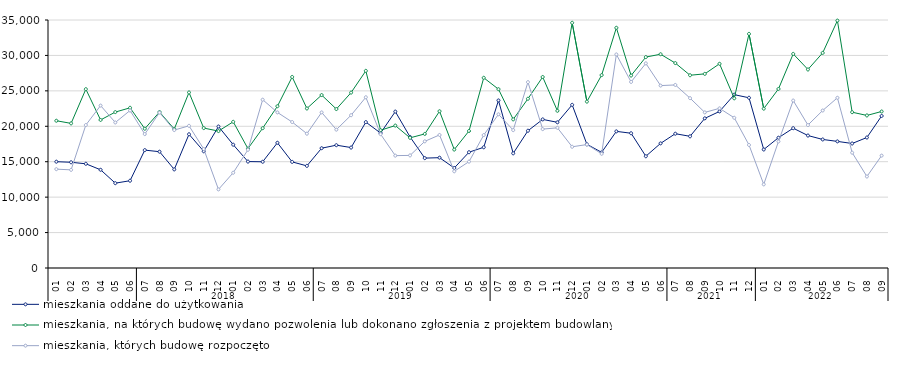
| Category | mieszkania oddane do użytkowania | mieszkania, na których budowę wydano pozwolenia lub dokonano zgłoszenia z projektem budowlanym | mieszkania, których budowę rozpoczęto |
|---|---|---|---|
| 0 | 15005 | 20783 | 13949 |
| 1 | 14921 | 20410 | 13851 |
| 2 | 14708 | 25239 | 20178 |
| 3 | 13861 | 20895 | 22924 |
| 4 | 11972 | 22003 | 20536 |
| 5 | 12319 | 22608 | 22228 |
| 6 | 16637 | 19658 | 18900 |
| 7 | 16415 | 22017 | 21929 |
| 8 | 13914 | 19613 | 19466 |
| 9 | 18871 | 24773 | 20063 |
| 10 | 16470 | 19748 | 16792 |
| 11 | 19970 | 19325 | 11091 |
| 12 | 17405 | 20630 | 13444 |
| 13 | 15021 | 16849 | 16682 |
| 14 | 14991 | 19732 | 23752 |
| 15 | 17673 | 22828 | 21958 |
| 16 | 14974 | 26965 | 20600 |
| 17 | 14412 | 22514 | 18956 |
| 18 | 16908 | 24407 | 21958 |
| 19 | 17334 | 22431 | 19528 |
| 20 | 16998 | 24754 | 21566 |
| 21 | 20592 | 27824 | 24095 |
| 22 | 19042 | 19448 | 18884 |
| 23 | 22075 | 20101 | 15858 |
| 24 | 18501 | 18370 | 15891 |
| 25 | 15507 | 18920 | 17875 |
| 26 | 15569 | 22122 | 18777 |
| 27 | 14116 | 16714 | 13647 |
| 28 | 16343 | 19338 | 15012 |
| 29 | 17036 | 26845 | 18763 |
| 30 | 23648 | 25237 | 21690 |
| 31 | 16183 | 20975 | 19460 |
| 32 | 19369 | 23885 | 26232 |
| 33 | 20973 | 26960 | 19601 |
| 34 | 20560 | 22183 | 19785 |
| 35 | 23026 | 34605 | 17109 |
| 36 | 17462 | 23485 | 17419 |
| 37 | 16322 | 27222 | 16116 |
| 38 | 19282 | 33901 | 30143 |
| 39 | 19019 | 27163 | 26261 |
| 40 | 15772 | 29768 | 28878 |
| 41 | 17587 | 30170 | 25744 |
| 42 | 18952 | 28922 | 25837 |
| 43 | 18583 | 27204 | 23971 |
| 44 | 21117 | 27397 | 21959 |
| 45 | 22097 | 28821 | 22533 |
| 46 | 24463 | 23947 | 21200 |
| 47 | 24024 | 33041 | 17364 |
| 48 | 16723 | 22490 | 11800 |
| 49 | 18388 | 25271 | 17855 |
| 50 | 19731 | 30215 | 23632 |
| 51 | 18694 | 28017 | 20173 |
| 52 | 18140 | 30360 | 22226 |
| 53 | 17868 | 34918 | 24021 |
| 54 | 17571 | 21987 | 16277 |
| 55 | 18417 | 21530 | 12913 |
| 56 | 21460 | 22089 | 15861 |